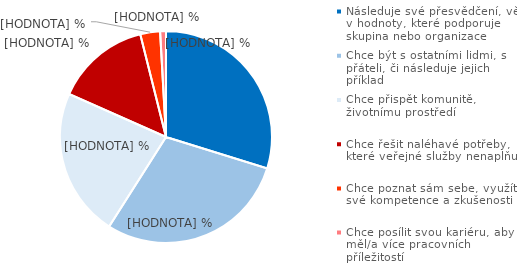
| Category | Series 0 |
|---|---|
| Následuje své přesvědčení, věří v hodnoty, které podporuje skupina nebo organizace | 29.789 |
| Chce být s ostatními lidmi, s přáteli, či následuje jejich příklad | 29.218 |
| Chce přispět komunitě, životnímu prostředí | 22.635 |
| Chce řešit naléhavé potřeby, které veřejné služby nenaplňují | 14.454 |
| Chce poznat sám sebe, využít své kompetence a zkušenosti | 3.013 |
| Chce posílit svou kariéru, aby měl/a více pracovních příležitostí | 0.892 |